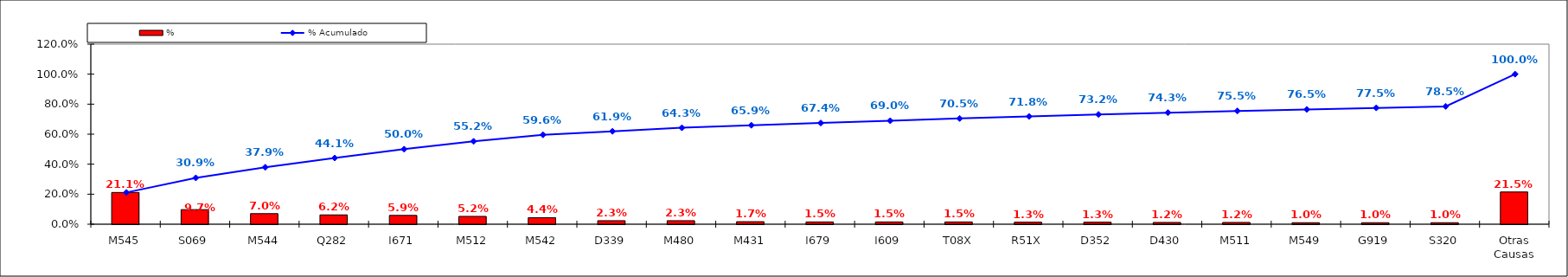
| Category | % |
|---|---|
| M545 | 0.211 |
| S069 | 0.097 |
| M544 | 0.07 |
| Q282 | 0.062 |
| I671 | 0.059 |
| M512 | 0.052 |
| M542 | 0.044 |
| D339 | 0.023 |
| M480 | 0.023 |
| M431 | 0.017 |
| I679 | 0.015 |
| I609 | 0.015 |
| T08X | 0.015 |
| R51X | 0.013 |
| D352 | 0.013 |
| D430 | 0.012 |
| M511 | 0.012 |
| M549 | 0.01 |
| G919 | 0.01 |
| S320 | 0.01 |
| Otras Causas | 0.215 |